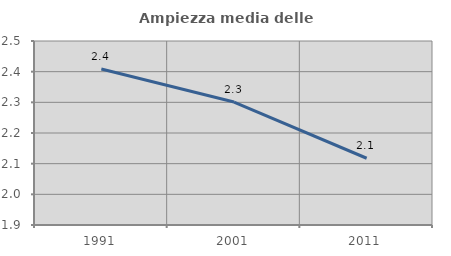
| Category | Ampiezza media delle famiglie |
|---|---|
| 1991.0 | 2.409 |
| 2001.0 | 2.301 |
| 2011.0 | 2.118 |